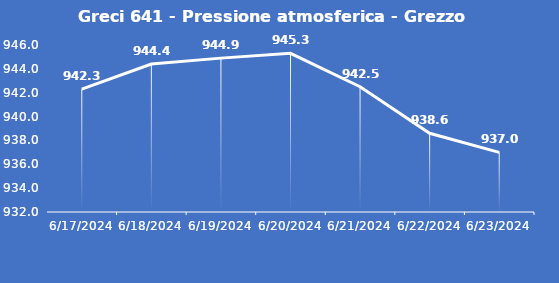
| Category | Greci 641 - Pressione atmosferica - Grezzo (hPa) |
|---|---|
| 6/17/24 | 942.3 |
| 6/18/24 | 944.4 |
| 6/19/24 | 944.9 |
| 6/20/24 | 945.3 |
| 6/21/24 | 942.5 |
| 6/22/24 | 938.6 |
| 6/23/24 | 937 |